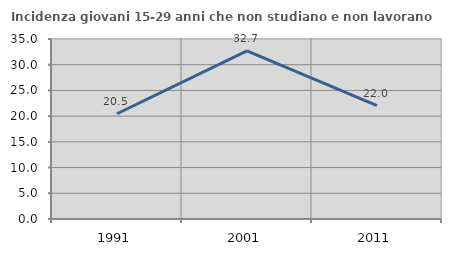
| Category | Incidenza giovani 15-29 anni che non studiano e non lavorano  |
|---|---|
| 1991.0 | 20.465 |
| 2001.0 | 32.707 |
| 2011.0 | 22.036 |